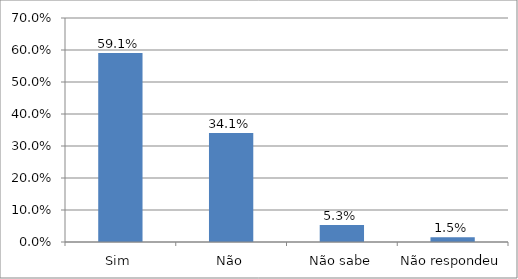
| Category | Series 0 |
|---|---|
| Sim | 0.591 |
| Não | 0.341 |
| Não sabe | 0.053 |
| Não respondeu | 0.015 |